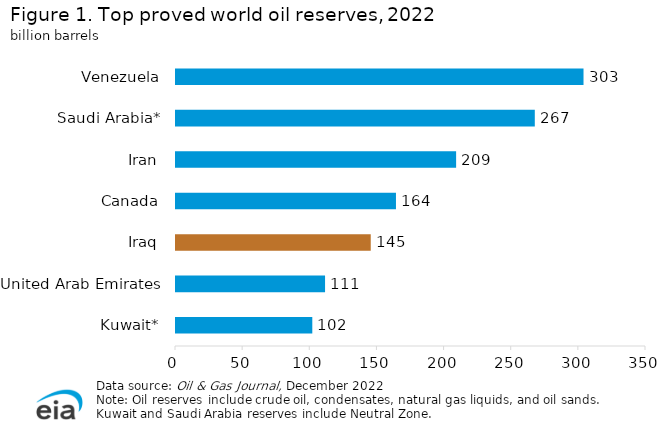
| Category | Series 0 |
|---|---|
| Kuwait* | 101.5 |
| United Arab Emirates | 111 |
| Iraq | 145.019 |
| Canada | 163.806 |
| Iran | 208.6 |
| Saudi Arabia* | 267.192 |
| Venezuela | 303.468 |